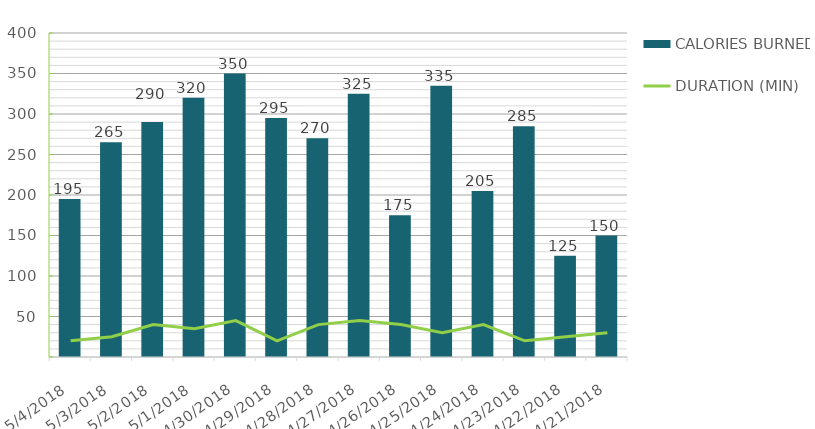
| Category | CALORIES BURNED |
|---|---|
| 5/4/18 | 195 |
| 5/3/18 | 265 |
| 5/2/18 | 290 |
| 5/1/18 | 320 |
| 4/30/18 | 350 |
| 4/29/18 | 295 |
| 4/28/18 | 270 |
| 4/27/18 | 325 |
| 4/26/18 | 175 |
| 4/25/18 | 335 |
| 4/24/18 | 205 |
| 4/23/18 | 285 |
| 4/22/18 | 125 |
| 4/21/18 | 150 |